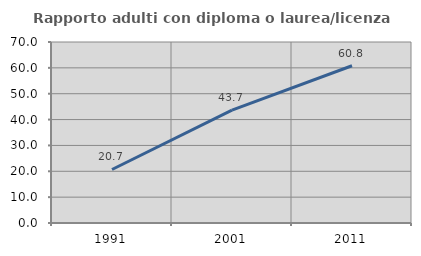
| Category | Rapporto adulti con diploma o laurea/licenza media  |
|---|---|
| 1991.0 | 20.696 |
| 2001.0 | 43.688 |
| 2011.0 | 60.804 |